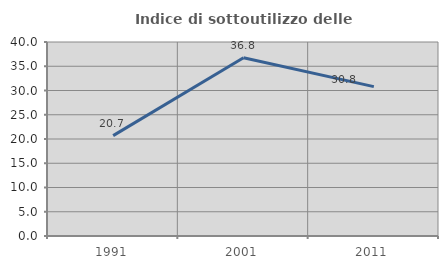
| Category | Indice di sottoutilizzo delle abitazioni  |
|---|---|
| 1991.0 | 20.69 |
| 2001.0 | 36.759 |
| 2011.0 | 30.8 |